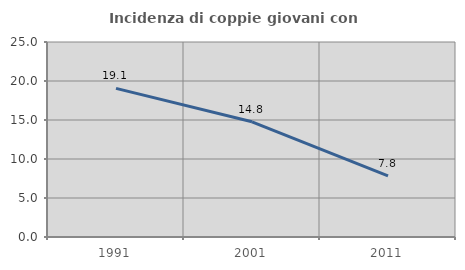
| Category | Incidenza di coppie giovani con figli |
|---|---|
| 1991.0 | 19.059 |
| 2001.0 | 14.771 |
| 2011.0 | 7.827 |